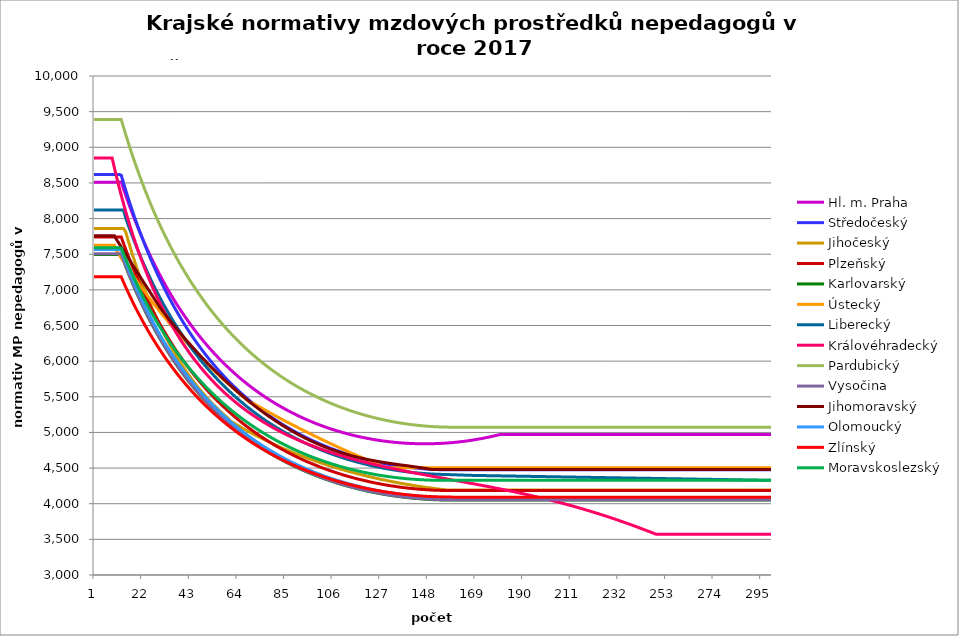
| Category | Hl. m. Praha | Středočeský | Jihočeský | Plzeňský | Karlovarský  | Ústecký   | Liberecký | Královéhradecký | Pardubický | Vysočina | Jihomoravský | Olomoucký | Zlínský | Moravskoslezský |
|---|---|---|---|---|---|---|---|---|---|---|---|---|---|---|
| 0 | 8511.038 | 8619.444 | 7860.65 | 7740.718 | 7496.677 | 7624.648 | 8120.322 | 8849.185 | 9389.89 | 7505.184 | 7757.725 | 7565.608 | 7182.125 | 7589.077 |
| 1 | 8511.038 | 8619.444 | 7860.65 | 7740.718 | 7496.677 | 7624.648 | 8120.322 | 8849.185 | 9389.89 | 7505.184 | 7757.725 | 7565.608 | 7182.125 | 7589.077 |
| 2 | 8511.038 | 8619.444 | 7860.65 | 7740.718 | 7496.677 | 7624.648 | 8120.322 | 8849.185 | 9389.89 | 7505.184 | 7757.725 | 7565.608 | 7182.125 | 7589.077 |
| 3 | 8511.038 | 8619.444 | 7860.65 | 7740.718 | 7496.677 | 7624.648 | 8120.322 | 8849.185 | 9389.89 | 7505.184 | 7757.725 | 7565.608 | 7182.125 | 7589.077 |
| 4 | 8511.038 | 8619.444 | 7860.65 | 7740.718 | 7496.677 | 7624.648 | 8120.322 | 8849.185 | 9389.89 | 7505.184 | 7757.725 | 7565.608 | 7182.125 | 7589.077 |
| 5 | 8511.038 | 8619.444 | 7860.65 | 7740.718 | 7496.677 | 7624.648 | 8120.322 | 8849.185 | 9389.89 | 7505.184 | 7757.725 | 7565.608 | 7182.125 | 7589.077 |
| 6 | 8511.038 | 8619.444 | 7860.65 | 7740.718 | 7496.677 | 7624.648 | 8120.322 | 8849.185 | 9389.89 | 7505.184 | 7757.725 | 7565.608 | 7182.125 | 7589.077 |
| 7 | 8511.038 | 8619.444 | 7860.65 | 7740.718 | 7496.677 | 7624.648 | 8120.322 | 8849.185 | 9389.89 | 7505.184 | 7757.725 | 7565.608 | 7182.125 | 7589.077 |
| 8 | 8511.038 | 8619.444 | 7860.65 | 7740.718 | 7496.677 | 7624.648 | 8120.322 | 8849.185 | 9389.89 | 7505.184 | 7757.725 | 7565.608 | 7182.125 | 7589.077 |
| 9 | 8511.038 | 8619.444 | 7860.65 | 7740.718 | 7496.677 | 7624.648 | 8120.322 | 8711.522 | 9389.89 | 7505.184 | 7757.725 | 7565.608 | 7182.125 | 7589.077 |
| 10 | 8511.038 | 8619.444 | 7860.65 | 7740.718 | 7496.677 | 7548.235 | 8120.322 | 8578.076 | 9389.89 | 7505.184 | 7702.149 | 7565.608 | 7182.125 | 7589.077 |
| 11 | 8511.038 | 8619.444 | 7860.65 | 7740.718 | 7496.677 | 7499.221 | 8120.322 | 8448.656 | 9389.89 | 7505.184 | 7653.769 | 7565.608 | 7182.125 | 7589.077 |
| 12 | 8512.477 | 8608.982 | 7860.65 | 7740.718 | 7496.743 | 7447.635 | 8120.394 | 8326.952 | 9389.974 | 7505.184 | 7602.829 | 7565.608 | 7182.125 | 7587.935 |
| 13 | 8417.493 | 8501.059 | 7860.65 | 7652.562 | 7410.717 | 7399.915 | 8120.486 | 8212.466 | 9282.221 | 7419.061 | 7552.562 | 7476.601 | 7108.883 | 7508.208 |
| 14 | 8325.293 | 8396.528 | 7811.908 | 7566.392 | 7327.213 | 7352.801 | 8006.101 | 8097.424 | 9177.63 | 7335.527 | 7502.956 | 7392.848 | 7037.608 | 7430.687 |
| 15 | 8235.765 | 8295.239 | 7700.734 | 7482.141 | 7246.129 | 7303.204 | 7916.739 | 7989.122 | 9076.068 | 7254.475 | 7450.958 | 7310.95 | 6968.226 | 7355.289 |
| 16 | 8148.801 | 8197.05 | 7593.781 | 7399.746 | 7167.366 | 7257.31 | 7829.951 | 7883.678 | 8977.415 | 7175.499 | 7402.673 | 7230.847 | 6900.669 | 7281.932 |
| 17 | 8064.301 | 8101.828 | 7490.831 | 7322.213 | 7090.831 | 7211.99 | 7745.635 | 7784.361 | 8881.552 | 7098.818 | 7352.051 | 7155.463 | 6834.869 | 7210.541 |
| 18 | 7982.168 | 8009.447 | 7391.679 | 7246.288 | 7016.438 | 7164.268 | 7663.692 | 7687.516 | 8788.372 | 7024.342 | 7302.117 | 7078.713 | 6770.764 | 7141.042 |
| 19 | 7902.311 | 7919.79 | 7296.134 | 7171.921 | 6944.102 | 7120.099 | 7584.03 | 7593.051 | 8697.768 | 6951.982 | 7249.98 | 7006.452 | 6708.294 | 7073.368 |
| 20 | 7824.645 | 7832.743 | 7204.02 | 7099.065 | 6873.746 | 7076.471 | 7506.56 | 7504.02 | 8609.644 | 6881.658 | 7201.418 | 6935.651 | 6647.401 | 7007.452 |
| 21 | 7749.087 | 7748.202 | 7115.171 | 7027.675 | 6805.293 | 7030.519 | 7431.199 | 7417.053 | 8523.904 | 6813.015 | 7150.704 | 6866.267 | 6588.032 | 6943.233 |
| 22 | 7675.559 | 7666.066 | 7029.43 | 6957.706 | 6738.673 | 6987.979 | 7357.868 | 7335.08 | 8440.46 | 6746.266 | 7100.699 | 6800.951 | 6530.134 | 6880.65 |
| 23 | 7603.988 | 7586.241 | 6946.654 | 6891.834 | 6673.819 | 6945.95 | 7286.491 | 7251.963 | 8359.228 | 6681.339 | 7051.389 | 6734.223 | 6473.657 | 6819.648 |
| 24 | 7534.304 | 7508.636 | 6866.705 | 6827.198 | 6610.666 | 6901.673 | 7216.998 | 7173.579 | 8280.126 | 6618.168 | 7002.759 | 6671.384 | 6418.556 | 6760.172 |
| 25 | 7466.438 | 7433.166 | 6789.457 | 6763.763 | 6549.153 | 6860.673 | 7149.319 | 7099.683 | 8203.079 | 6556.687 | 6954.795 | 6609.707 | 6364.783 | 6702.171 |
| 26 | 7400.328 | 7359.751 | 6714.789 | 6701.496 | 6489.223 | 6820.157 | 7083.391 | 7024.539 | 8128.014 | 6496.587 | 6904.873 | 6549.16 | 6312.297 | 6645.595 |
| 27 | 7335.914 | 7288.315 | 6642.588 | 6640.365 | 6430.819 | 6777.465 | 7019.152 | 6956.366 | 8054.861 | 6438.068 | 6855.664 | 6489.713 | 6261.056 | 6590.399 |
| 28 | 7273.136 | 7218.783 | 6572.749 | 6582.818 | 6373.89 | 6737.923 | 6956.542 | 6886.856 | 7983.554 | 6381.074 | 6807.151 | 6431.334 | 6211.02 | 6536.536 |
| 29 | 7211.94 | 7151.088 | 6505.173 | 6523.824 | 6318.384 | 6698.84 | 6895.506 | 6821.317 | 7914.031 | 6325.554 | 6756.821 | 6376.366 | 6162.151 | 6483.964 |
| 30 | 7152.274 | 7085.162 | 6439.764 | 6468.271 | 6264.254 | 6657.648 | 6835.991 | 6757.014 | 7846.231 | 6271.455 | 6714.622 | 6320 | 6114.414 | 6432.643 |
| 31 | 7094.087 | 7020.944 | 6376.434 | 6413.656 | 6211.454 | 6619.488 | 6777.946 | 6693.911 | 7780.096 | 6218.502 | 6672.946 | 6266.91 | 6067.774 | 6382.532 |
| 32 | 7037.33 | 6958.374 | 6315.1 | 6362.272 | 6159.94 | 6581.763 | 6721.322 | 6634.432 | 7715.573 | 6166.885 | 6631.785 | 6214.705 | 6022.197 | 6333.595 |
| 33 | 6981.959 | 6897.395 | 6255.683 | 6309.426 | 6109.671 | 6541.994 | 6666.072 | 6576 | 7652.609 | 6116.56 | 6591.129 | 6165.577 | 5977.653 | 6285.795 |
| 34 | 6927.93 | 6837.952 | 6198.107 | 6259.692 | 6060.606 | 6505.145 | 6612.153 | 6518.589 | 7591.154 | 6067.483 | 6550.968 | 6115.039 | 5934.109 | 6239.098 |
| 35 | 6875.199 | 6779.994 | 6142.302 | 6208.529 | 6012.708 | 6468.708 | 6559.522 | 6464.502 | 7531.159 | 6019.616 | 6511.293 | 6067.468 | 5891.537 | 6193.471 |
| 36 | 6823.728 | 6723.472 | 6088.202 | 6160.367 | 5965.939 | 6430.29 | 6508.138 | 6411.306 | 7472.579 | 5972.709 | 6472.096 | 6020.632 | 5849.909 | 6148.882 |
| 37 | 6773.477 | 6668.338 | 6035.743 | 6112.946 | 5920.265 | 6394.684 | 6457.962 | 6358.978 | 7415.371 | 5926.942 | 6433.369 | 5974.513 | 5809.197 | 6105.301 |
| 38 | 6724.411 | 6614.548 | 5984.864 | 6068.357 | 5875.653 | 6359.471 | 6408.957 | 6307.497 | 7359.492 | 5882.279 | 6395.101 | 5929.095 | 5769.377 | 6062.698 |
| 39 | 6676.492 | 6562.057 | 5935.509 | 6022.337 | 5832.069 | 6322.336 | 6361.088 | 6259.029 | 7304.902 | 5838.687 | 6357.287 | 5884.362 | 5730.422 | 6021.047 |
| 40 | 6629.689 | 6510.826 | 5887.624 | 5979.055 | 5789.484 | 6287.913 | 6314.32 | 6211.3 | 7251.563 | 5796.133 | 6319.917 | 5842.288 | 5692.309 | 5980.319 |
| 41 | 6583.967 | 6460.815 | 5841.158 | 5936.391 | 5747.868 | 6251.606 | 6268.621 | 6166.414 | 7199.437 | 5754.391 | 6282.984 | 5800.811 | 5655.014 | 5940.489 |
| 42 | 6539.297 | 6411.985 | 5796.061 | 5894.332 | 5707.193 | 6217.947 | 6223.959 | 6120.082 | 7148.489 | 5713.63 | 6248.615 | 5757.987 | 5618.517 | 5901.533 |
| 43 | 6495.648 | 6364.301 | 5752.287 | 5852.864 | 5667.43 | 6184.648 | 6180.303 | 6076.501 | 7098.685 | 5673.823 | 6212.508 | 5719.6 | 5582.794 | 5863.425 |
| 44 | 6452.991 | 6317.729 | 5709.793 | 5811.976 | 5628.555 | 6149.521 | 6137.626 | 6033.535 | 7049.993 | 5634.942 | 6176.816 | 5679.841 | 5547.827 | 5826.144 |
| 45 | 6411.3 | 6272.235 | 5668.536 | 5773.562 | 5590.542 | 6116.949 | 6095.9 | 5993.177 | 7002.38 | 5596.96 | 6141.532 | 5640.631 | 5513.594 | 5789.667 |
| 46 | 6370.546 | 6227.787 | 5628.477 | 5735.653 | 5553.367 | 6084.721 | 6055.097 | 5953.355 | 6955.817 | 5559.669 | 6106.649 | 5603.788 | 5480.077 | 5753.973 |
| 47 | 6330.706 | 6184.355 | 5589.576 | 5698.239 | 5517.008 | 6050.716 | 6015.191 | 5914.059 | 6910.274 | 5523.232 | 6072.159 | 5567.424 | 5447.257 | 5719.042 |
| 48 | 6291.754 | 6141.909 | 5551.799 | 5661.309 | 5481.44 | 6019.18 | 5976.159 | 5875.279 | 6865.725 | 5487.625 | 6040.053 | 5531.528 | 5415.117 | 5684.853 |
| 49 | 6253.667 | 6100.422 | 5515.11 | 5624.855 | 5446.644 | 5987.971 | 5937.977 | 5838.905 | 6822.141 | 5452.825 | 6006.31 | 5496.092 | 5383.64 | 5651.388 |
| 50 | 6216.422 | 6059.866 | 5479.477 | 5588.868 | 5412.599 | 5955.036 | 5900.621 | 5802.979 | 6779.498 | 5418.81 | 5972.941 | 5461.108 | 5352.809 | 5618.628 |
| 51 | 6179.998 | 6020.216 | 5444.868 | 5555.103 | 5379.284 | 5924.487 | 5864.071 | 5767.493 | 6737.77 | 5385.388 | 5939.942 | 5428.282 | 5322.609 | 5586.557 |
| 52 | 6144.372 | 5981.447 | 5411.253 | 5521.745 | 5346.681 | 5894.25 | 5828.303 | 5732.438 | 6696.934 | 5352.714 | 5909.214 | 5395.849 | 5293.023 | 5555.155 |
| 53 | 6109.526 | 5943.534 | 5378.603 | 5488.784 | 5314.771 | 5862.335 | 5793.299 | 5699.618 | 6656.966 | 5320.769 | 5876.913 | 5363.801 | 5264.038 | 5524.409 |
| 54 | 6075.44 | 5906.454 | 5346.891 | 5456.215 | 5283.537 | 5832.727 | 5759.039 | 5667.173 | 6617.844 | 5289.533 | 5844.963 | 5332.132 | 5235.638 | 5494.3 |
| 55 | 6042.095 | 5870.186 | 5316.091 | 5425.714 | 5252.962 | 5803.417 | 5725.504 | 5635.094 | 6579.546 | 5258.988 | 5815.208 | 5300.834 | 5207.811 | 5464.815 |
| 56 | 6009.472 | 5834.708 | 5286.178 | 5393.887 | 5223.028 | 5772.476 | 5692.675 | 5605.13 | 6542.054 | 5228.955 | 5783.924 | 5269.902 | 5180.542 | 5435.938 |
| 57 | 5977.554 | 5800 | 5257.127 | 5364.077 | 5193.721 | 5743.767 | 5660.535 | 5573.748 | 6505.345 | 5199.583 | 5752.975 | 5240.929 | 5153.819 | 5407.656 |
| 58 | 5946.326 | 5766.041 | 5228.917 | 5334.595 | 5165.024 | 5715.341 | 5629.067 | 5544.431 | 6469.401 | 5170.854 | 5724.147 | 5212.272 | 5127.629 | 5379.954 |
| 59 | 5915.769 | 5732.814 | 5201.525 | 5305.436 | 5136.924 | 5685.33 | 5598.255 | 5517.118 | 6434.204 | 5142.753 | 5693.832 | 5183.927 | 5101.961 | 5352.819 |
| 60 | 5885.869 | 5700.298 | 5164.043 | 5276.593 | 5109.405 | 5657.479 | 5568.083 | 5488.392 | 6399.736 | 5115.265 | 5665.592 | 5155.889 | 5076.802 | 5326.238 |
| 61 | 5856.61 | 5668.477 | 5144.544 | 5249.639 | 5082.455 | 5629.899 | 5538.535 | 5461.628 | 6365.98 | 5088.222 | 5635.893 | 5128.153 | 5052.142 | 5300.199 |
| 62 | 5827.978 | 5637.334 | 5125.338 | 5221.399 | 5056.059 | 5600.776 | 5509.598 | 5435.123 | 6332.918 | 5061.766 | 5608.223 | 5102.23 | 5027.97 | 5274.69 |
| 63 | 5799.959 | 5606.852 | 5106.421 | 5195.004 | 5030.205 | 5573.745 | 5481.256 | 5408.874 | 6300.535 | 5035.883 | 5579.121 | 5076.568 | 5004.274 | 5249.7 |
| 64 | 5772.539 | 5577.015 | 5087.787 | 5168.876 | 5004.881 | 5546.974 | 5453.497 | 5382.878 | 6268.815 | 5010.56 | 5552.005 | 5049.676 | 4981.046 | 5225.216 |
| 65 | 5745.705 | 5547.808 | 5069.433 | 5143.009 | 4980.074 | 5518.7 | 5426.306 | 5358.732 | 6237.743 | 4985.784 | 5525.151 | 5024.539 | 4958.274 | 5201.228 |
| 66 | 5719.444 | 5519.216 | 5051.354 | 5117.399 | 4955.773 | 5492.454 | 5399.672 | 5334.802 | 6207.306 | 4961.397 | 5498.556 | 5001.108 | 4935.949 | 5177.726 |
| 67 | 5693.744 | 5491.225 | 5033.545 | 5093.528 | 4931.967 | 5466.456 | 5373.581 | 5311.085 | 6177.487 | 4937.535 | 5472.216 | 4976.45 | 4914.063 | 5154.7 |
| 68 | 5668.594 | 5463.822 | 5016.002 | 5069.878 | 4908.645 | 5438.995 | 5348.023 | 5287.577 | 6148.275 | 4914.186 | 5446.126 | 4953.464 | 4892.606 | 5132.139 |
| 69 | 5643.981 | 5436.992 | 4998.72 | 5046.447 | 4885.796 | 5413.5 | 5322.984 | 5265.824 | 6119.657 | 4891.34 | 5420.285 | 4930.69 | 4871.569 | 5110.034 |
| 70 | 5619.894 | 5410.723 | 4981.696 | 5023.232 | 4863.411 | 5413.5 | 5298.455 | 5242.715 | 6091.618 | 4868.985 | 5394.687 | 4908.124 | 4850.944 | 5088.377 |
| 71 | 5596.323 | 5385.003 | 4964.925 | 5000.229 | 4841.479 | 5394.955 | 5274.423 | 5221.329 | 6064.147 | 4846.973 | 5369.33 | 4885.763 | 4830.724 | 5067.157 |
| 72 | 5573.258 | 5359.819 | 4948.404 | 4977.436 | 4819.991 | 5376.536 | 5250.88 | 5200.116 | 6037.233 | 4825.433 | 5345.774 | 4863.605 | 4810.899 | 5046.366 |
| 73 | 5550.688 | 5335.16 | 4932.129 | 4956.255 | 4798.938 | 5358.243 | 5227.814 | 5180.572 | 6010.864 | 4804.356 | 5320.873 | 4843.014 | 4791.462 | 5025.997 |
| 74 | 5528.604 | 5311.014 | 4916.095 | 4935.254 | 4778.311 | 5340.074 | 5205.216 | 5159.689 | 5985.028 | 4783.733 | 5297.739 | 4821.242 | 4772.407 | 5006.04 |
| 75 | 5506.996 | 5287.372 | 4900.3 | 4914.43 | 4758.102 | 5322.028 | 5183.077 | 5140.448 | 5959.714 | 4763.555 | 5274.805 | 4801.007 | 4753.725 | 4986.489 |
| 76 | 5485.855 | 5264.222 | 4884.739 | 4893.782 | 4738.301 | 5304.103 | 5161.386 | 5121.349 | 5934.913 | 4743.678 | 5250.56 | 4780.942 | 4735.409 | 4967.334 |
| 77 | 5465.173 | 5241.554 | 4869.41 | 4873.305 | 4718.902 | 5286.298 | 5140.136 | 5102.392 | 5910.615 | 4724.23 | 5228.032 | 4761.043 | 4717.454 | 4948.57 |
| 78 | 5444.941 | 5219.359 | 4854.308 | 4854.348 | 4699.896 | 5268.613 | 5119.318 | 5085.017 | 5886.809 | 4705.203 | 5207.179 | 4742.62 | 4699.852 | 4930.188 |
| 79 | 5425.15 | 5197.626 | 4839.43 | 4834.2 | 4681.275 | 5251.046 | 5098.922 | 5066.327 | 5863.486 | 4686.587 | 5185.021 | 4724.339 | 4682.597 | 4912.182 |
| 80 | 5405.792 | 5176.347 | 4824.774 | 4815.546 | 4663.033 | 5233.595 | 5078.942 | 5049.197 | 5840.636 | 4668.375 | 5163.051 | 4704.908 | 4665.682 | 4894.546 |
| 81 | 5386.861 | 5155.513 | 4810.336 | 4797.035 | 4645.161 | 5216.26 | 5059.37 | 5032.182 | 5818.252 | 4650.432 | 5142.712 | 4686.916 | 4649.103 | 4877.271 |
| 82 | 5368.348 | 5135.115 | 4796.112 | 4779.973 | 4627.654 | 5199.04 | 5040.197 | 5015.281 | 5796.324 | 4632.88 | 5122.534 | 4669.061 | 4632.852 | 4860.354 |
| 83 | 5350.246 | 5115.144 | 4782.1 | 4761.733 | 4610.505 | 5181.932 | 5021.416 | 4998.494 | 5774.843 | 4615.712 | 5101.088 | 4652.603 | 4616.925 | 4843.786 |
| 84 | 5332.549 | 5095.594 | 4768.297 | 4744.921 | 4593.707 | 5164.937 | 5003.021 | 4983.204 | 5753.803 | 4598.919 | 5082.647 | 4635.008 | 4601.315 | 4827.562 |
| 85 | 5315.248 | 5076.455 | 4754.7 | 4726.948 | 4577.253 | 5149.584 | 4985.004 | 4966.63 | 5733.194 | 4582.497 | 5062.936 | 4618.789 | 4586.018 | 4811.677 |
| 86 | 5298.339 | 5057.72 | 4741.306 | 4710.38 | 4561.139 | 5132.8 | 4967.359 | 4951.534 | 5713.01 | 4566.314 | 5043.377 | 4602.682 | 4571.028 | 4796.125 |
| 87 | 5281.813 | 5039.383 | 4728.112 | 4693.928 | 4545.357 | 5116.125 | 4950.078 | 4936.529 | 5693.243 | 4550.49 | 5025.351 | 4586.688 | 4556.341 | 4780.9 |
| 88 | 5265.666 | 5021.435 | 4715.116 | 4678.843 | 4529.902 | 5099.558 | 4933.157 | 4922.967 | 5673.885 | 4535.018 | 5007.452 | 4570.804 | 4541.95 | 4765.997 |
| 89 | 5249.891 | 5003.87 | 4702.315 | 4662.61 | 4514.769 | 5083.099 | 4916.588 | 4908.135 | 5654.93 | 4519.892 | 4989.681 | 4556.24 | 4527.853 | 4751.411 |
| 90 | 5234.483 | 4986.682 | 4689.706 | 4647.725 | 4499.952 | 5066.745 | 4900.366 | 4893.392 | 5636.372 | 4505.106 | 4972.035 | 4540.566 | 4514.043 | 4737.137 |
| 91 | 5219.435 | 4969.863 | 4677.287 | 4632.936 | 4485.446 | 5050.496 | 4884.485 | 4880.065 | 5618.202 | 4490.536 | 4954.513 | 4526.194 | 4500.517 | 4723.171 |
| 92 | 5204.743 | 4953.407 | 4665.056 | 4618.239 | 4471.246 | 5034.35 | 4868.94 | 4866.812 | 5600.416 | 4476.296 | 4938.449 | 4511.912 | 4487.271 | 4709.506 |
| 93 | 5190.401 | 4937.309 | 4653.009 | 4603.636 | 4457.347 | 5018.308 | 4853.724 | 4853.629 | 5583.007 | 4462.381 | 4922.489 | 4497.72 | 4474.299 | 4696.14 |
| 94 | 5176.403 | 4921.562 | 4641.145 | 4589.125 | 4443.744 | 5002.368 | 4838.834 | 4840.519 | 5565.969 | 4448.787 | 4906.631 | 4483.616 | 4461.599 | 4683.068 |
| 95 | 5162.746 | 4906.162 | 4629.461 | 4575.904 | 4430.433 | 4986.528 | 4824.263 | 4827.478 | 5549.296 | 4435.507 | 4890.875 | 4470.766 | 4449.165 | 4670.285 |
| 96 | 5149.424 | 4891.101 | 4617.955 | 4562.758 | 4417.409 | 4970.789 | 4810.006 | 4815.802 | 5532.982 | 4422.421 | 4876.521 | 4457.989 | 4436.994 | 4657.787 |
| 97 | 5136.433 | 4876.375 | 4606.624 | 4549.688 | 4404.667 | 4955.149 | 4796.06 | 4802.895 | 5517.023 | 4409.642 | 4862.251 | 4444.134 | 4425.083 | 4645.57 |
| 98 | 5123.768 | 4861.979 | 4595.468 | 4536.692 | 4392.204 | 4939.607 | 4782.418 | 4791.337 | 5501.413 | 4397.165 | 4846.778 | 4431.508 | 4413.428 | 4633.63 |
| 99 | 5111.425 | 4847.907 | 4584.483 | 4523.77 | 4380.016 | 4924.161 | 4769.078 | 4779.835 | 5486.146 | 4384.986 | 4833.959 | 4420.093 | 4402.025 | 4621.964 |
| 100 | 5099.399 | 4834.155 | 4573.667 | 4510.922 | 4368.097 | 4908.813 | 4756.034 | 4768.387 | 5471.218 | 4373.099 | 4819.937 | 4407.603 | 4390.87 | 4610.568 |
| 101 | 5087.687 | 4820.718 | 4563.018 | 4499.305 | 4356.446 | 4893.559 | 4743.282 | 4756.995 | 5456.624 | 4361.389 | 4807.259 | 4396.311 | 4379.961 | 4599.438 |
| 102 | 5076.284 | 4807.592 | 4552.535 | 4487.747 | 4345.057 | 4878.4 | 4730.818 | 4745.657 | 5442.359 | 4349.965 | 4794.648 | 4383.955 | 4369.294 | 4588.571 |
| 103 | 5065.188 | 4794.771 | 4542.216 | 4476.249 | 4333.928 | 4863.335 | 4718.638 | 4735.624 | 5428.419 | 4338.823 | 4782.104 | 4372.783 | 4358.867 | 4577.963 |
| 104 | 5054.393 | 4782.252 | 4532.058 | 4464.81 | 4323.054 | 4848.363 | 4706.738 | 4724.387 | 5414.799 | 4327.959 | 4769.624 | 4362.777 | 4348.675 | 4567.612 |
| 105 | 5043.897 | 4770.03 | 4522.06 | 4454.564 | 4312.432 | 4833.482 | 4695.114 | 4714.444 | 5401.495 | 4317.37 | 4758.448 | 4351.712 | 4338.716 | 4557.514 |
| 106 | 5033.697 | 4758.102 | 4512.219 | 4443.235 | 4302.059 | 4818.693 | 4683.763 | 4704.542 | 5388.503 | 4306.941 | 4747.325 | 4340.703 | 4328.988 | 4547.666 |
| 107 | 5023.788 | 4746.463 | 4502.535 | 4433.088 | 4291.933 | 4803.993 | 4672.682 | 4693.452 | 5375.819 | 4296.781 | 4736.253 | 4330.843 | 4319.487 | 4538.065 |
| 108 | 5014.168 | 4735.109 | 4493.005 | 4422.987 | 4282.048 | 4789.383 | 4661.866 | 4683.638 | 5363.438 | 4286.886 | 4726.455 | 4321.027 | 4310.211 | 4528.708 |
| 109 | 5004.834 | 4724.038 | 4483.628 | 4412.933 | 4272.404 | 4774.862 | 4651.312 | 4675.085 | 5351.358 | 4277.252 | 4715.48 | 4311.256 | 4301.156 | 4519.593 |
| 110 | 4995.782 | 4713.245 | 4474.402 | 4402.923 | 4262.996 | 4760.429 | 4641.018 | 4665.348 | 5339.574 | 4267.876 | 4705.767 | 4301.529 | 4292.322 | 4510.717 |
| 111 | 4987.01 | 4702.726 | 4465.325 | 4394.064 | 4253.821 | 4746.082 | 4630.98 | 4655.651 | 5328.083 | 4258.648 | 4696.095 | 4292.92 | 4283.704 | 4502.077 |
| 112 | 4978.514 | 4692.48 | 4456.397 | 4384.141 | 4244.878 | 4731.822 | 4621.195 | 4647.199 | 5316.881 | 4249.674 | 4687.664 | 4283.275 | 4275.301 | 4493.67 |
| 113 | 4970.293 | 4682.501 | 4447.614 | 4375.357 | 4236.164 | 4717.647 | 4611.66 | 4637.578 | 5305.966 | 4240.949 | 4678.065 | 4274.738 | 4267.11 | 4485.495 |
| 114 | 4962.344 | 4672.788 | 4438.976 | 4366.608 | 4228.731 | 4703.557 | 4602.372 | 4629.191 | 5295.333 | 4232.472 | 4669.699 | 4266.236 | 4259.13 | 4477.549 |
| 115 | 4954.664 | 4663.337 | 4430.482 | 4357.895 | 4219.409 | 4690.82 | 4593.329 | 4620.835 | 5284.98 | 4224.239 | 4661.362 | 4257.767 | 4251.357 | 4469.829 |
| 116 | 4947.251 | 4654.145 | 4422.129 | 4349.216 | 4211.365 | 4676.89 | 4584.528 | 4611.323 | 5274.904 | 4216.144 | 4653.055 | 4249.331 | 4243.79 | 4462.334 |
| 117 | 4940.103 | 4645.21 | 4413.917 | 4341.65 | 4203.539 | 4663.042 | 4575.966 | 4603.031 | 5265.102 | 4208.288 | 4645.958 | 4241.978 | 4236.427 | 4455.062 |
| 118 | 4933.216 | 4636.528 | 4405.844 | 4334.111 | 4195.929 | 4649.275 | 4567.641 | 4594.769 | 5255.57 | 4200.67 | 4638.883 | 4233.605 | 4229.266 | 4448.009 |
| 119 | 4926.591 | 4628.097 | 4397.908 | 4326.597 | 4188.534 | 4635.59 | 4559.55 | 4586.537 | 5246.307 | 4193.286 | 4631.83 | 4226.305 | 4222.304 | 4441.175 |
| 120 | 4920.223 | 4619.914 | 4390.109 | 4319.11 | 4181.35 | 4621.985 | 4551.691 | 4579.504 | 5237.31 | 4186.136 | 4624.798 | 4219.031 | 4215.541 | 4434.557 |
| 121 | 4914.112 | 4611.978 | 4382.445 | 4311.649 | 4174.376 | 4608.46 | 4544.062 | 4571.327 | 5228.575 | 4179.113 | 4617.787 | 4211.782 | 4208.974 | 4428.154 |
| 122 | 4908.255 | 4604.285 | 4374.915 | 4304.213 | 4167.611 | 4595.013 | 4536.661 | 4563.178 | 5220.101 | 4172.32 | 4611.961 | 4205.588 | 4202.601 | 4421.964 |
| 123 | 4902.65 | 4596.833 | 4367.517 | 4297.86 | 4161.051 | 4581.645 | 4529.485 | 4556.217 | 5211.885 | 4165.753 | 4606.149 | 4198.385 | 4196.421 | 4415.984 |
| 124 | 4897.297 | 4589.62 | 4360.25 | 4291.525 | 4154.696 | 4568.354 | 4522.533 | 4548.122 | 5203.924 | 4159.411 | 4599.195 | 4192.231 | 4190.432 | 4410.214 |
| 125 | 4892.194 | 4582.644 | 4353.114 | 4285.21 | 4148.543 | 4555.141 | 4515.803 | 4541.206 | 5196.218 | 4153.292 | 4594.57 | 4186.094 | 4184.633 | 4404.652 |
| 126 | 4887.338 | 4575.903 | 4346.107 | 4278.913 | 4142.591 | 4542.003 | 4509.292 | 4533.165 | 5188.763 | 4147.292 | 4588.802 | 4179.976 | 4179.023 | 4399.297 |
| 127 | 4882.728 | 4569.395 | 4339.227 | 4272.634 | 4136.838 | 4528.941 | 4502.999 | 4526.295 | 5181.557 | 4141.512 | 4583.049 | 4173.875 | 4173.598 | 4394.146 |
| 128 | 4878.364 | 4563.118 | 4332.474 | 4267.416 | 4131.283 | 4515.954 | 4496.922 | 4519.445 | 5174.599 | 4135.951 | 4578.457 | 4168.805 | 4168.359 | 4389.199 |
| 129 | 4874.243 | 4557.07 | 4325.847 | 4261.171 | 4125.924 | 4503.041 | 4491.06 | 4512.616 | 5167.886 | 4130.605 | 4572.73 | 4163.747 | 4163.304 | 4384.454 |
| 130 | 4870.365 | 4551.249 | 4319.345 | 4255.981 | 4120.759 | 4503.041 | 4485.41 | 4505.808 | 5161.416 | 4125.475 | 4568.158 | 4157.693 | 4158.432 | 4379.909 |
| 131 | 4866.729 | 4545.654 | 4312.966 | 4250.803 | 4115.787 | 4503.041 | 4479.972 | 4499.021 | 5155.189 | 4120.457 | 4563.596 | 4152.662 | 4153.741 | 4375.565 |
| 132 | 4863.333 | 4540.283 | 4306.709 | 4246.67 | 4111.007 | 4503.041 | 4474.744 | 4492.254 | 5149.202 | 4115.652 | 4559.042 | 4148.646 | 4149.231 | 4371.419 |
| 133 | 4860.176 | 4535.135 | 4300.574 | 4241.515 | 4106.417 | 4503.041 | 4469.724 | 4485.507 | 5143.453 | 4111.057 | 4554.498 | 4143.637 | 4144.899 | 4367.47 |
| 134 | 4857.258 | 4530.208 | 4294.56 | 4237.4 | 4102.017 | 4503.041 | 4464.911 | 4478.78 | 5137.942 | 4106.672 | 4549.963 | 4139.638 | 4140.745 | 4363.718 |
| 135 | 4854.577 | 4525.501 | 4288.666 | 4232.267 | 4097.805 | 4503.041 | 4460.304 | 4472.074 | 5132.666 | 4102.495 | 4545.436 | 4134.651 | 4136.769 | 4360.161 |
| 136 | 4852.133 | 4521.011 | 4282.89 | 4228.17 | 4093.779 | 4503.041 | 4455.901 | 4465.387 | 5127.624 | 4098.425 | 4540.919 | 4130.669 | 4132.968 | 4356.799 |
| 137 | 4849.925 | 4516.739 | 4277.232 | 4224.081 | 4089.94 | 4503.041 | 4451.702 | 4459.831 | 5122.815 | 4094.561 | 4537.537 | 4126.696 | 4129.343 | 4353.63 |
| 138 | 4847.953 | 4512.683 | 4271.691 | 4221.02 | 4086.285 | 4503.041 | 4447.704 | 4453.181 | 5118.237 | 4090.903 | 4533.036 | 4123.72 | 4125.891 | 4350.654 |
| 139 | 4846.216 | 4508.842 | 4266.266 | 4216.944 | 4082.815 | 4503.041 | 4443.908 | 4446.551 | 5113.89 | 4087.448 | 4528.543 | 4119.76 | 4122.613 | 4347.869 |
| 140 | 4844.713 | 4505.214 | 4260.957 | 4213.893 | 4079.527 | 4503.041 | 4440.312 | 4439.941 | 5109.772 | 4084.195 | 4524.059 | 4116.795 | 4119.507 | 4345.276 |
| 141 | 4843.443 | 4501.799 | 4255.762 | 4210.846 | 4076.421 | 4503.041 | 4436.915 | 4434.447 | 5105.882 | 4081.047 | 4519.585 | 4113.834 | 4116.573 | 4342.874 |
| 142 | 4842.408 | 4498.596 | 4250.681 | 4207.803 | 4073.496 | 4503.041 | 4433.717 | 4427.872 | 5102.218 | 4078.099 | 4515.119 | 4110.877 | 4113.81 | 4340.661 |
| 143 | 4841.606 | 4495.603 | 4245.713 | 4204.765 | 4070.752 | 4503.041 | 4430.716 | 4422.409 | 5098.781 | 4075.352 | 4510.661 | 4107.924 | 4111.217 | 4338.638 |
| 144 | 4841.037 | 4492.82 | 4240.857 | 4201.732 | 4068.188 | 4503.041 | 4427.911 | 4415.87 | 5095.569 | 4072.804 | 4506.213 | 4104.976 | 4108.794 | 4336.803 |
| 145 | 4840.7 | 4490.247 | 4236.112 | 4199.712 | 4065.803 | 4503.041 | 4425.302 | 4410.436 | 5092.582 | 4070.455 | 4500.665 | 4103.013 | 4106.54 | 4335.157 |
| 146 | 4840.597 | 4487.882 | 4231.478 | 4197.693 | 4063.596 | 4503.041 | 4422.889 | 4403.932 | 5089.818 | 4068.207 | 4496.236 | 4100.072 | 4104.454 | 4333.699 |
| 147 | 4840.726 | 4485.725 | 4226.955 | 4195.677 | 4061.567 | 4503.041 | 4420.67 | 4398.527 | 5087.276 | 4066.156 | 4490.713 | 4098.113 | 4102.536 | 4332.428 |
| 148 | 4841.088 | 4483.775 | 4222.54 | 4193.663 | 4059.715 | 4503.041 | 4418.645 | 4392.059 | 5084.957 | 4064.303 | 4485.202 | 4096.157 | 4100.786 | 4331.344 |
| 149 | 4841.683 | 4482.031 | 4218.235 | 4191.651 | 4058.041 | 4503.041 | 4416.813 | 4386.683 | 5082.859 | 4062.645 | 4479.706 | 4095.179 | 4099.203 | 4330.448 |
| 150 | 4842.511 | 4480.494 | 4214.037 | 4189.64 | 4056.542 | 4503.041 | 4415.175 | 4380.249 | 5080.983 | 4061.184 | 4479.706 | 4093.225 | 4097.787 | 4329.738 |
| 151 | 4843.573 | 4479.163 | 4209.947 | 4188.636 | 4055.22 | 4503.041 | 4413.729 | 4374.902 | 5079.327 | 4059.822 | 4479.706 | 4092.249 | 4096.537 | 4329.214 |
| 152 | 4844.868 | 4478.037 | 4205.964 | 4187.632 | 4054.073 | 4503.041 | 4412.475 | 4368.503 | 5077.891 | 4058.654 | 4479.706 | 4091.273 | 4095.453 | 4328.877 |
| 153 | 4846.397 | 4477.117 | 4202.087 | 4186.628 | 4053.102 | 4503.041 | 4411.413 | 4363.185 | 5076.674 | 4057.682 | 4479.706 | 4090.298 | 4094.535 | 4328.726 |
| 154 | 4848.161 | 4476.401 | 4198.316 | 4185.625 | 4052.306 | 4503.041 | 4410.542 | 4356.82 | 5075.677 | 4056.905 | 4479.706 | 4089.323 | 4093.782 | 4328.307 |
| 155 | 4850.159 | 4475.89 | 4194.65 | 4185.625 | 4051.685 | 4503.041 | 4409.863 | 4351.53 | 5074.899 | 4056.322 | 4479.706 | 4088.349 | 4093.195 | 4328.307 |
| 156 | 4852.393 | 4475.583 | 4192.347 | 4184.623 | 4051.239 | 4503.041 | 4409.375 | 4345.199 | 5074.34 | 4055.836 | 4479.706 | 4088.349 | 4092.773 | 4328.307 |
| 157 | 4854.863 | 4475.481 | 4192.347 | 4184.623 | 4050.967 | 4503.041 | 4407.784 | 4339.937 | 5074 | 4055.545 | 4479.706 | 4087.375 | 4092.516 | 4328.307 |
| 158 | 4857.57 | 4475.583 | 4192.347 | 4184.623 | 4050.871 | 4503.041 | 4406.724 | 4333.64 | 5073.879 | 4055.448 | 4479.706 | 4087.375 | 4092.425 | 4328.307 |
| 159 | 4860.515 | 4475.583 | 4192.347 | 4184.623 | 4050.948 | 4503.041 | 4405.665 | 4328.406 | 5073.733 | 4055.351 | 4479.706 | 4087.375 | 4091.398 | 4328.307 |
| 160 | 4863.698 | 4475.583 | 4192.347 | 4184.623 | 4050.754 | 4503.041 | 4404.606 | 4322.142 | 5073.733 | 4055.351 | 4479.706 | 4087.375 | 4091.398 | 4328.307 |
| 161 | 4867.121 | 4475.583 | 4192.347 | 4184.623 | 4050.754 | 4503.041 | 4403.548 | 4316.936 | 5073.733 | 4055.351 | 4479.706 | 4087.375 | 4091.398 | 4328.307 |
| 162 | 4870.784 | 4475.583 | 4192.347 | 4184.623 | 4050.754 | 4503.041 | 4402.49 | 4310.705 | 5073.733 | 4055.351 | 4479.706 | 4087.375 | 4091.398 | 4328.307 |
| 163 | 4874.689 | 4475.583 | 4192.347 | 4184.623 | 4050.754 | 4503.041 | 4401.433 | 4305.526 | 5073.733 | 4055.351 | 4479.706 | 4087.375 | 4091.398 | 4328.307 |
| 164 | 4878.837 | 4475.583 | 4192.347 | 4184.623 | 4050.754 | 4503.041 | 4400.376 | 4299.328 | 5073.733 | 4055.351 | 4479.706 | 4087.375 | 4091.398 | 4328.307 |
| 165 | 4883.228 | 4475.583 | 4192.347 | 4184.623 | 4050.754 | 4503.041 | 4399.32 | 4293.148 | 5073.733 | 4055.351 | 4479.706 | 4087.375 | 4091.398 | 4328.307 |
| 166 | 4887.865 | 4475.583 | 4192.347 | 4184.623 | 4050.754 | 4503.041 | 4398.264 | 4286.986 | 5073.733 | 4055.351 | 4479.706 | 4087.375 | 4091.398 | 4328.307 |
| 167 | 4892.748 | 4475.583 | 4192.347 | 4184.623 | 4050.754 | 4503.041 | 4397.209 | 4281.864 | 5073.733 | 4055.351 | 4479.706 | 4087.375 | 4091.398 | 4328.307 |
| 168 | 4897.88 | 4475.583 | 4192.347 | 4184.623 | 4050.754 | 4503.041 | 4397.209 | 4275.734 | 5073.733 | 4055.351 | 4479.706 | 4087.375 | 4091.398 | 4328.307 |
| 169 | 4903.261 | 4475.583 | 4192.347 | 4184.623 | 4050.754 | 4503.041 | 4396.154 | 4269.621 | 5073.733 | 4055.351 | 4479.706 | 4087.375 | 4091.398 | 4328.307 |
| 170 | 4908.893 | 4475.583 | 4192.347 | 4184.623 | 4050.754 | 4503.041 | 4395.581 | 4263.526 | 5073.733 | 4055.351 | 4479.706 | 4087.375 | 4091.398 | 4328.307 |
| 171 | 4914.778 | 4475.583 | 4192.347 | 4184.623 | 4050.754 | 4503.041 | 4395.046 | 4257.448 | 5073.733 | 4055.351 | 4479.706 | 4087.375 | 4091.398 | 4328.307 |
| 172 | 4920.918 | 4475.583 | 4192.347 | 4184.623 | 4050.754 | 4503.041 | 4394.511 | 4251.388 | 5073.733 | 4055.351 | 4479.706 | 4087.375 | 4091.398 | 4328.307 |
| 173 | 4927.314 | 4475.583 | 4192.347 | 4184.623 | 4050.754 | 4503.041 | 4393.977 | 4245.345 | 5073.733 | 4055.351 | 4479.706 | 4087.375 | 4091.398 | 4328.307 |
| 174 | 4933.969 | 4475.583 | 4192.347 | 4184.623 | 4050.754 | 4503.041 | 4393.442 | 4239.319 | 5073.733 | 4055.351 | 4479.706 | 4087.375 | 4091.398 | 4328.307 |
| 175 | 4940.884 | 4475.583 | 4192.347 | 4184.623 | 4050.754 | 4503.041 | 4392.907 | 4233.31 | 5073.733 | 4055.351 | 4479.706 | 4087.375 | 4091.398 | 4328.307 |
| 176 | 4948.062 | 4475.583 | 4192.347 | 4184.623 | 4050.754 | 4503.041 | 4392.373 | 4227.318 | 5073.733 | 4055.351 | 4479.706 | 4087.375 | 4091.398 | 4328.307 |
| 177 | 4955.504 | 4475.583 | 4192.347 | 4184.623 | 4050.754 | 4503.041 | 4391.839 | 4220.349 | 5073.733 | 4055.351 | 4479.706 | 4087.375 | 4091.398 | 4328.307 |
| 178 | 4963.214 | 4475.583 | 4192.347 | 4184.623 | 4050.754 | 4503.041 | 4391.305 | 4214.393 | 5073.733 | 4055.351 | 4479.706 | 4087.375 | 4091.398 | 4328.307 |
| 179 | 4971.193 | 4475.583 | 4192.347 | 4184.623 | 4050.754 | 4503.041 | 4390.77 | 4208.455 | 5073.733 | 4055.351 | 4479.706 | 4087.375 | 4091.398 | 4328.307 |
| 180 | 4971.193 | 4475.583 | 4192.347 | 4184.623 | 4050.754 | 4503.041 | 4390.237 | 4201.547 | 5073.733 | 4055.351 | 4479.706 | 4087.375 | 4091.398 | 4328.307 |
| 181 | 4971.193 | 4475.583 | 4192.347 | 4184.623 | 4050.754 | 4503.041 | 4389.703 | 4195.645 | 5073.733 | 4055.351 | 4479.706 | 4087.375 | 4091.398 | 4328.307 |
| 182 | 4971.193 | 4475.583 | 4192.347 | 4184.623 | 4050.754 | 4503.041 | 4389.169 | 4188.78 | 5073.733 | 4055.351 | 4479.706 | 4087.375 | 4091.398 | 4328.307 |
| 183 | 4971.193 | 4475.583 | 4192.347 | 4184.623 | 4050.754 | 4503.041 | 4388.636 | 4181.937 | 5073.733 | 4055.351 | 4479.706 | 4087.375 | 4091.398 | 4328.307 |
| 184 | 4971.193 | 4475.583 | 4192.347 | 4184.623 | 4050.754 | 4503.041 | 4388.102 | 4175.116 | 5073.733 | 4055.351 | 4479.706 | 4087.375 | 4091.398 | 4328.307 |
| 185 | 4971.193 | 4475.583 | 4192.347 | 4184.623 | 4050.754 | 4503.041 | 4387.569 | 4169.288 | 5073.733 | 4055.351 | 4479.706 | 4087.375 | 4091.398 | 4328.307 |
| 186 | 4971.193 | 4475.583 | 4192.347 | 4184.623 | 4050.754 | 4503.041 | 4387.036 | 4162.509 | 5073.733 | 4055.351 | 4479.706 | 4087.375 | 4091.398 | 4328.307 |
| 187 | 4971.193 | 4475.583 | 4192.347 | 4184.623 | 4050.754 | 4503.041 | 4386.503 | 4155.751 | 5073.733 | 4055.351 | 4479.706 | 4087.375 | 4091.398 | 4328.307 |
| 188 | 4971.193 | 4475.583 | 4192.347 | 4184.623 | 4050.754 | 4503.041 | 4385.97 | 4148.056 | 5073.733 | 4055.351 | 4479.706 | 4087.375 | 4091.398 | 4328.307 |
| 189 | 4971.193 | 4475.583 | 4192.347 | 4184.623 | 4050.754 | 4503.041 | 4385.437 | 4141.345 | 5073.733 | 4055.351 | 4479.706 | 4087.375 | 4091.398 | 4328.307 |
| 190 | 4971.193 | 4475.583 | 4192.347 | 4184.623 | 4050.754 | 4503.041 | 4384.905 | 4134.656 | 5073.733 | 4055.351 | 4479.706 | 4087.375 | 4091.398 | 4328.307 |
| 191 | 4971.193 | 4475.583 | 4192.347 | 4184.623 | 4050.754 | 4503.041 | 4384.372 | 4127.038 | 5073.733 | 4055.351 | 4479.706 | 4087.375 | 4091.398 | 4328.307 |
| 192 | 4971.193 | 4475.583 | 4192.347 | 4184.623 | 4050.754 | 4503.041 | 4383.84 | 4120.395 | 5073.733 | 4055.351 | 4479.706 | 4087.375 | 4091.398 | 4328.307 |
| 193 | 4971.193 | 4475.583 | 4192.347 | 4184.623 | 4050.754 | 4503.041 | 4383.308 | 4112.83 | 5073.733 | 4055.351 | 4479.706 | 4087.375 | 4091.398 | 4328.307 |
| 194 | 4971.193 | 4475.583 | 4192.347 | 4184.623 | 4050.754 | 4503.041 | 4382.776 | 4105.292 | 5073.733 | 4055.351 | 4479.706 | 4087.375 | 4091.398 | 4328.307 |
| 195 | 4971.193 | 4475.583 | 4192.347 | 4184.623 | 4050.754 | 4503.041 | 4382.244 | 4097.782 | 5073.733 | 4055.351 | 4479.706 | 4087.375 | 4091.398 | 4328.307 |
| 196 | 4971.193 | 4475.583 | 4192.347 | 4184.623 | 4050.754 | 4503.041 | 4381.712 | 4090.299 | 5073.733 | 4055.351 | 4479.706 | 4087.375 | 4091.398 | 4328.307 |
| 197 | 4971.193 | 4475.583 | 4192.347 | 4184.623 | 4050.754 | 4503.041 | 4381.18 | 4082.843 | 5073.733 | 4055.351 | 4479.706 | 4087.375 | 4091.398 | 4328.307 |
| 198 | 4971.193 | 4475.583 | 4192.347 | 4184.623 | 4050.754 | 4503.041 | 4380.649 | 4075.415 | 5073.733 | 4055.351 | 4479.706 | 4087.375 | 4091.398 | 4328.307 |
| 199 | 4971.193 | 4475.583 | 4192.347 | 4184.623 | 4050.754 | 4503.041 | 4380.117 | 4068.014 | 5073.733 | 4055.351 | 4479.706 | 4087.375 | 4091.398 | 4328.307 |
| 200 | 4971.193 | 4475.583 | 4192.347 | 4184.623 | 4050.754 | 4503.041 | 4379.586 | 4059.719 | 5073.733 | 4055.351 | 4479.706 | 4087.375 | 4091.398 | 4328.307 |
| 201 | 4971.193 | 4475.583 | 4192.347 | 4184.623 | 4050.754 | 4503.041 | 4379.055 | 4052.374 | 5073.733 | 4055.351 | 4479.706 | 4087.375 | 4091.398 | 4328.307 |
| 202 | 4971.193 | 4475.583 | 4192.347 | 4184.623 | 4050.754 | 4503.041 | 4378.524 | 4044.144 | 5073.733 | 4055.351 | 4479.706 | 4087.375 | 4091.398 | 4328.307 |
| 203 | 4971.193 | 4475.583 | 4192.347 | 4184.623 | 4050.754 | 4503.041 | 4377.993 | 4035.946 | 5073.733 | 4055.351 | 4479.706 | 4087.375 | 4091.398 | 4328.307 |
| 204 | 4971.193 | 4475.583 | 4192.347 | 4184.623 | 4050.754 | 4503.041 | 4377.462 | 4027.782 | 5073.733 | 4055.351 | 4479.706 | 4087.375 | 4091.398 | 4328.307 |
| 205 | 4971.193 | 4475.583 | 4192.347 | 4184.623 | 4050.754 | 4503.041 | 4376.931 | 4019.65 | 5073.733 | 4055.351 | 4479.706 | 4087.375 | 4091.398 | 4328.307 |
| 206 | 4971.193 | 4475.583 | 4192.347 | 4184.623 | 4050.754 | 4503.041 | 4376.401 | 4010.654 | 5073.733 | 4055.351 | 4479.706 | 4087.375 | 4091.398 | 4328.307 |
| 207 | 4971.193 | 4475.583 | 4192.347 | 4184.623 | 4050.754 | 4503.041 | 4375.87 | 4002.591 | 5073.733 | 4055.351 | 4479.706 | 4087.375 | 4091.398 | 4328.307 |
| 208 | 4971.193 | 4475.583 | 4192.347 | 4184.623 | 4050.754 | 4503.041 | 4375.34 | 3993.671 | 5073.733 | 4055.351 | 4479.706 | 4087.375 | 4091.398 | 4328.307 |
| 209 | 4971.193 | 4475.583 | 4192.347 | 4184.623 | 4050.754 | 4503.041 | 4374.81 | 3985.676 | 5073.733 | 4055.351 | 4479.706 | 4087.375 | 4091.398 | 4328.307 |
| 210 | 4971.193 | 4475.583 | 4192.347 | 4184.623 | 4050.754 | 4503.041 | 4374.28 | 3976.831 | 5073.733 | 4055.351 | 4479.706 | 4087.375 | 4091.398 | 4328.307 |
| 211 | 4971.193 | 4475.583 | 4192.347 | 4184.623 | 4050.754 | 4503.041 | 4373.75 | 3968.025 | 5073.733 | 4055.351 | 4479.706 | 4087.375 | 4091.398 | 4328.307 |
| 212 | 4971.193 | 4475.583 | 4192.347 | 4184.623 | 4050.754 | 4503.041 | 4373.22 | 3959.258 | 5073.733 | 4055.351 | 4479.706 | 4087.375 | 4091.398 | 4328.307 |
| 213 | 4971.193 | 4475.583 | 4192.347 | 4184.623 | 4050.754 | 4503.041 | 4372.691 | 3949.658 | 5073.733 | 4055.351 | 4479.706 | 4087.375 | 4091.398 | 4328.307 |
| 214 | 4971.193 | 4475.583 | 4192.347 | 4184.623 | 4050.754 | 4503.041 | 4372.161 | 3940.972 | 5073.733 | 4055.351 | 4479.706 | 4087.375 | 4091.398 | 4328.307 |
| 215 | 4971.193 | 4475.583 | 4192.347 | 4184.623 | 4050.754 | 4503.041 | 4371.632 | 3931.461 | 5073.733 | 4055.351 | 4479.706 | 4087.375 | 4091.398 | 4328.307 |
| 216 | 4971.193 | 4475.583 | 4192.347 | 4184.623 | 4050.754 | 4503.041 | 4371.102 | 3921.996 | 5073.733 | 4055.351 | 4479.706 | 4087.375 | 4091.398 | 4328.307 |
| 217 | 4971.193 | 4475.583 | 4192.347 | 4184.623 | 4050.754 | 4503.041 | 4370.573 | 3912.576 | 5073.733 | 4055.351 | 4479.706 | 4087.375 | 4091.398 | 4328.307 |
| 218 | 4971.193 | 4475.583 | 4192.347 | 4184.623 | 4050.754 | 4503.041 | 4370.044 | 3903.202 | 5073.733 | 4055.351 | 4479.706 | 4087.375 | 4091.398 | 4328.307 |
| 219 | 4971.193 | 4475.583 | 4192.347 | 4184.623 | 4050.754 | 4503.041 | 4369.515 | 3893.872 | 5073.733 | 4055.351 | 4479.706 | 4087.375 | 4091.398 | 4328.307 |
| 220 | 4971.193 | 4475.583 | 4192.347 | 4184.623 | 4050.754 | 4503.041 | 4368.987 | 3883.745 | 5073.733 | 4055.351 | 4479.706 | 4087.375 | 4091.398 | 4328.307 |
| 221 | 4971.193 | 4475.583 | 4192.347 | 4184.623 | 4050.754 | 4503.041 | 4368.458 | 3873.671 | 5073.733 | 4055.351 | 4479.706 | 4087.375 | 4091.398 | 4328.307 |
| 222 | 4971.193 | 4475.583 | 4192.347 | 4184.623 | 4050.754 | 4503.041 | 4367.93 | 3864.481 | 5073.733 | 4055.351 | 4479.706 | 4087.375 | 4091.398 | 4328.307 |
| 223 | 4971.193 | 4475.583 | 4192.347 | 4184.623 | 4050.754 | 4503.041 | 4367.401 | 3854.506 | 5073.733 | 4055.351 | 4479.706 | 4087.375 | 4091.398 | 4328.307 |
| 224 | 4971.193 | 4475.583 | 4192.347 | 4184.623 | 4050.754 | 4503.041 | 4366.873 | 3843.758 | 5073.733 | 4055.351 | 4479.706 | 4087.375 | 4091.398 | 4328.307 |
| 225 | 4971.193 | 4475.583 | 4192.347 | 4184.623 | 4050.754 | 4503.041 | 4366.345 | 3833.89 | 5073.733 | 4055.351 | 4479.706 | 4087.375 | 4091.398 | 4328.307 |
| 226 | 4971.193 | 4475.583 | 4192.347 | 4184.623 | 4050.754 | 4503.041 | 4365.817 | 3823.256 | 5073.733 | 4055.351 | 4479.706 | 4087.375 | 4091.398 | 4328.307 |
| 227 | 4971.193 | 4475.583 | 4192.347 | 4184.623 | 4050.754 | 4503.041 | 4365.289 | 3812.681 | 5073.733 | 4055.351 | 4479.706 | 4087.375 | 4091.398 | 4328.307 |
| 228 | 4971.193 | 4475.583 | 4192.347 | 4184.623 | 4050.754 | 4503.041 | 4364.761 | 3802.164 | 5073.733 | 4055.351 | 4479.706 | 4087.375 | 4091.398 | 4328.307 |
| 229 | 4971.193 | 4475.583 | 4192.347 | 4184.623 | 4050.754 | 4503.041 | 4364.234 | 3791.705 | 5073.733 | 4055.351 | 4479.706 | 4087.375 | 4091.398 | 4328.307 |
| 230 | 4971.193 | 4475.583 | 4192.347 | 4184.623 | 4050.754 | 4503.041 | 4363.706 | 3781.304 | 5073.733 | 4055.351 | 4479.706 | 4087.375 | 4091.398 | 4328.307 |
| 231 | 4971.193 | 4475.583 | 4192.347 | 4184.623 | 4050.754 | 4503.041 | 4363.179 | 3770.166 | 5073.733 | 4055.351 | 4479.706 | 4087.375 | 4091.398 | 4328.307 |
| 232 | 4971.193 | 4475.583 | 4192.347 | 4184.623 | 4050.754 | 4503.041 | 4362.652 | 3759.094 | 5073.733 | 4055.351 | 4479.706 | 4087.375 | 4091.398 | 4328.307 |
| 233 | 4971.193 | 4475.583 | 4192.347 | 4184.623 | 4050.754 | 4503.041 | 4362.125 | 3748.086 | 5073.733 | 4055.351 | 4479.706 | 4087.375 | 4091.398 | 4328.307 |
| 234 | 4971.193 | 4475.583 | 4192.347 | 4184.623 | 4050.754 | 4503.041 | 4361.598 | 3737.143 | 5073.733 | 4055.351 | 4479.706 | 4087.375 | 4091.398 | 4328.307 |
| 235 | 4971.193 | 4475.583 | 4192.347 | 4184.623 | 4050.754 | 4503.041 | 4361.071 | 3725.489 | 5073.733 | 4055.351 | 4479.706 | 4087.375 | 4091.398 | 4328.307 |
| 236 | 4971.193 | 4475.583 | 4192.347 | 4184.623 | 4050.754 | 4503.041 | 4360.544 | 3713.907 | 5073.733 | 4055.351 | 4479.706 | 4087.375 | 4091.398 | 4328.307 |
| 237 | 4971.193 | 4475.583 | 4192.347 | 4184.623 | 4050.754 | 4503.041 | 4360.018 | 3703.162 | 5073.733 | 4055.351 | 4479.706 | 4087.375 | 4091.398 | 4328.307 |
| 238 | 4971.193 | 4475.583 | 4192.347 | 4184.623 | 4050.754 | 4503.041 | 4359.491 | 3690.958 | 5073.733 | 4055.351 | 4479.706 | 4087.375 | 4091.398 | 4328.307 |
| 239 | 4971.193 | 4475.583 | 4192.347 | 4184.623 | 4050.754 | 4503.041 | 4358.965 | 3679.589 | 5073.733 | 4055.351 | 4479.706 | 4087.375 | 4091.398 | 4328.307 |
| 240 | 4971.193 | 4475.583 | 4192.347 | 4184.623 | 4050.754 | 4503.041 | 4358.439 | 3667.54 | 5073.733 | 4055.351 | 4479.706 | 4087.375 | 4091.398 | 4328.307 |
| 241 | 4971.193 | 4475.583 | 4192.347 | 4184.623 | 4050.754 | 4503.041 | 4357.913 | 3655.569 | 5073.733 | 4055.351 | 4479.706 | 4087.375 | 4091.398 | 4328.307 |
| 242 | 4971.193 | 4475.583 | 4192.347 | 4184.623 | 4050.754 | 4503.041 | 4357.387 | 3643.676 | 5073.733 | 4055.351 | 4479.706 | 4087.375 | 4091.398 | 4328.307 |
| 243 | 4971.193 | 4475.583 | 4192.347 | 4184.623 | 4050.754 | 4503.041 | 4356.861 | 3631.861 | 5073.733 | 4055.351 | 4479.706 | 4087.375 | 4091.398 | 4328.307 |
| 244 | 4971.193 | 4475.583 | 4192.347 | 4184.623 | 4050.754 | 4503.041 | 4356.335 | 3619.39 | 5073.733 | 4055.351 | 4479.706 | 4087.375 | 4091.398 | 4328.307 |
| 245 | 4971.193 | 4475.583 | 4192.347 | 4184.623 | 4050.754 | 4503.041 | 4355.81 | 3607.731 | 5073.733 | 4055.351 | 4479.706 | 4087.375 | 4091.398 | 4328.307 |
| 246 | 4971.193 | 4475.583 | 4192.347 | 4184.623 | 4050.754 | 4503.041 | 4355.284 | 3595.425 | 5073.733 | 4055.351 | 4479.706 | 4087.375 | 4091.398 | 4328.307 |
| 247 | 4971.193 | 4475.583 | 4192.347 | 4184.623 | 4050.754 | 4503.041 | 4354.759 | 3582.487 | 5073.733 | 4055.351 | 4479.706 | 4087.375 | 4091.398 | 4328.307 |
| 248 | 4971.193 | 4475.583 | 4192.347 | 4184.623 | 4050.754 | 4503.041 | 4354.234 | 3570.353 | 5073.733 | 4055.351 | 4479.706 | 4087.375 | 4091.398 | 4328.307 |
| 249 | 4971.193 | 4475.583 | 4192.347 | 4184.623 | 4050.754 | 4503.041 | 4353.709 | 3570.353 | 5073.733 | 4055.351 | 4479.706 | 4087.375 | 4091.398 | 4328.307 |
| 250 | 4971.193 | 4475.583 | 4192.347 | 4184.623 | 4050.754 | 4503.041 | 4353.184 | 3570.353 | 5073.733 | 4055.351 | 4479.706 | 4087.375 | 4091.398 | 4328.307 |
| 251 | 4971.193 | 4475.583 | 4192.347 | 4184.623 | 4050.754 | 4503.041 | 4352.659 | 3570.353 | 5073.733 | 4055.351 | 4479.706 | 4087.375 | 4091.398 | 4328.307 |
| 252 | 4971.193 | 4475.583 | 4192.347 | 4184.623 | 4050.754 | 4503.041 | 4352.134 | 3570.353 | 5073.733 | 4055.351 | 4479.706 | 4087.375 | 4091.398 | 4328.307 |
| 253 | 4971.193 | 4475.583 | 4192.347 | 4184.623 | 4050.754 | 4503.041 | 4351.61 | 3570.353 | 5073.733 | 4055.351 | 4479.706 | 4087.375 | 4091.398 | 4328.307 |
| 254 | 4971.193 | 4475.583 | 4192.347 | 4184.623 | 4050.754 | 4503.041 | 4351.085 | 3570.353 | 5073.733 | 4055.351 | 4479.706 | 4087.375 | 4091.398 | 4328.307 |
| 255 | 4971.193 | 4475.583 | 4192.347 | 4184.623 | 4050.754 | 4503.041 | 4350.561 | 3570.353 | 5073.733 | 4055.351 | 4479.706 | 4087.375 | 4091.398 | 4328.307 |
| 256 | 4971.193 | 4475.583 | 4192.347 | 4184.623 | 4050.754 | 4503.041 | 4350.037 | 3570.353 | 5073.733 | 4055.351 | 4479.706 | 4087.375 | 4091.398 | 4328.307 |
| 257 | 4971.193 | 4475.583 | 4192.347 | 4184.623 | 4050.754 | 4503.041 | 4349.513 | 3570.353 | 5073.733 | 4055.351 | 4479.706 | 4087.375 | 4091.398 | 4328.307 |
| 258 | 4971.193 | 4475.583 | 4192.347 | 4184.623 | 4050.754 | 4503.041 | 4348.989 | 3570.353 | 5073.733 | 4055.351 | 4479.706 | 4087.375 | 4091.398 | 4328.307 |
| 259 | 4971.193 | 4475.583 | 4192.347 | 4184.623 | 4050.754 | 4503.041 | 4348.465 | 3570.353 | 5073.733 | 4055.351 | 4479.706 | 4087.375 | 4091.398 | 4328.307 |
| 260 | 4971.193 | 4475.583 | 4192.347 | 4184.623 | 4050.754 | 4503.041 | 4347.941 | 3570.353 | 5073.733 | 4055.351 | 4479.706 | 4087.375 | 4091.398 | 4328.307 |
| 261 | 4971.193 | 4475.583 | 4192.347 | 4184.623 | 4050.754 | 4503.041 | 4347.418 | 3570.353 | 5073.733 | 4055.351 | 4479.706 | 4087.375 | 4091.398 | 4328.307 |
| 262 | 4971.193 | 4475.583 | 4192.347 | 4184.623 | 4050.754 | 4503.041 | 4346.894 | 3570.353 | 5073.733 | 4055.351 | 4479.706 | 4087.375 | 4091.398 | 4328.307 |
| 263 | 4971.193 | 4475.583 | 4192.347 | 4184.623 | 4050.754 | 4503.041 | 4346.371 | 3570.353 | 5073.733 | 4055.351 | 4479.706 | 4087.375 | 4091.398 | 4328.307 |
| 264 | 4971.193 | 4475.583 | 4192.347 | 4184.623 | 4050.754 | 4503.041 | 4345.848 | 3570.353 | 5073.733 | 4055.351 | 4479.706 | 4087.375 | 4091.398 | 4328.307 |
| 265 | 4971.193 | 4475.583 | 4192.347 | 4184.623 | 4050.754 | 4503.041 | 4345.325 | 3570.353 | 5073.733 | 4055.351 | 4479.706 | 4087.375 | 4091.398 | 4328.307 |
| 266 | 4971.193 | 4475.583 | 4192.347 | 4184.623 | 4050.754 | 4503.041 | 4344.802 | 3570.353 | 5073.733 | 4055.351 | 4479.706 | 4087.375 | 4091.398 | 4328.307 |
| 267 | 4971.193 | 4475.583 | 4192.347 | 4184.623 | 4050.754 | 4503.041 | 4344.279 | 3570.353 | 5073.733 | 4055.351 | 4479.706 | 4087.375 | 4091.398 | 4328.307 |
| 268 | 4971.193 | 4475.583 | 4192.347 | 4184.623 | 4050.754 | 4503.041 | 4343.757 | 3570.353 | 5073.733 | 4055.351 | 4479.706 | 4087.375 | 4091.398 | 4328.307 |
| 269 | 4971.193 | 4475.583 | 4192.347 | 4184.623 | 4050.754 | 4503.041 | 4343.234 | 3570.353 | 5073.733 | 4055.351 | 4479.706 | 4087.375 | 4091.398 | 4328.307 |
| 270 | 4971.193 | 4475.583 | 4192.347 | 4184.623 | 4050.754 | 4503.041 | 4342.712 | 3570.353 | 5073.733 | 4055.351 | 4479.706 | 4087.375 | 4091.398 | 4328.307 |
| 271 | 4971.193 | 4475.583 | 4192.347 | 4184.623 | 4050.754 | 4503.041 | 4342.189 | 3570.353 | 5073.733 | 4055.351 | 4479.706 | 4087.375 | 4091.398 | 4328.307 |
| 272 | 4971.193 | 4475.583 | 4192.347 | 4184.623 | 4050.754 | 4503.041 | 4341.667 | 3570.353 | 5073.733 | 4055.351 | 4479.706 | 4087.375 | 4091.398 | 4328.307 |
| 273 | 4971.193 | 4475.583 | 4192.347 | 4184.623 | 4050.754 | 4503.041 | 4341.145 | 3570.353 | 5073.733 | 4055.351 | 4479.706 | 4087.375 | 4091.398 | 4328.307 |
| 274 | 4971.193 | 4475.583 | 4192.347 | 4184.623 | 4050.754 | 4503.041 | 4340.623 | 3570.353 | 5073.733 | 4055.351 | 4479.706 | 4087.375 | 4091.398 | 4328.307 |
| 275 | 4971.193 | 4475.583 | 4192.347 | 4184.623 | 4050.754 | 4503.041 | 4340.102 | 3570.353 | 5073.733 | 4055.351 | 4479.706 | 4087.375 | 4091.398 | 4328.307 |
| 276 | 4971.193 | 4475.583 | 4192.347 | 4184.623 | 4050.754 | 4503.041 | 4339.58 | 3570.353 | 5073.733 | 4055.351 | 4479.706 | 4087.375 | 4091.398 | 4328.307 |
| 277 | 4971.193 | 4475.583 | 4192.347 | 4184.623 | 4050.754 | 4503.041 | 4339.058 | 3570.353 | 5073.733 | 4055.351 | 4479.706 | 4087.375 | 4091.398 | 4328.307 |
| 278 | 4971.193 | 4475.583 | 4192.347 | 4184.623 | 4050.754 | 4503.041 | 4338.537 | 3570.353 | 5073.733 | 4055.351 | 4479.706 | 4087.375 | 4091.398 | 4328.307 |
| 279 | 4971.193 | 4475.583 | 4192.347 | 4184.623 | 4050.754 | 4503.041 | 4338.016 | 3570.353 | 5073.733 | 4055.351 | 4479.706 | 4087.375 | 4091.398 | 4328.307 |
| 280 | 4971.193 | 4475.583 | 4192.347 | 4184.623 | 4050.754 | 4503.041 | 4337.495 | 3570.353 | 5073.733 | 4055.351 | 4479.706 | 4087.375 | 4091.398 | 4328.307 |
| 281 | 4971.193 | 4475.583 | 4192.347 | 4184.623 | 4050.754 | 4503.041 | 4336.974 | 3570.353 | 5073.733 | 4055.351 | 4479.706 | 4087.375 | 4091.398 | 4328.307 |
| 282 | 4971.193 | 4475.583 | 4192.347 | 4184.623 | 4050.754 | 4503.041 | 4336.453 | 3570.353 | 5073.733 | 4055.351 | 4479.706 | 4087.375 | 4091.398 | 4328.307 |
| 283 | 4971.193 | 4475.583 | 4192.347 | 4184.623 | 4050.754 | 4503.041 | 4335.932 | 3570.353 | 5073.733 | 4055.351 | 4479.706 | 4087.375 | 4091.398 | 4328.307 |
| 284 | 4971.193 | 4475.583 | 4192.347 | 4184.623 | 4050.754 | 4503.041 | 4335.411 | 3570.353 | 5073.733 | 4055.351 | 4479.706 | 4087.375 | 4091.398 | 4328.307 |
| 285 | 4971.193 | 4475.583 | 4192.347 | 4184.623 | 4050.754 | 4503.041 | 4334.891 | 3570.353 | 5073.733 | 4055.351 | 4479.706 | 4087.375 | 4091.398 | 4328.307 |
| 286 | 4971.193 | 4475.583 | 4192.347 | 4184.623 | 4050.754 | 4503.041 | 4334.37 | 3570.353 | 5073.733 | 4055.351 | 4479.706 | 4087.375 | 4091.398 | 4328.307 |
| 287 | 4971.193 | 4475.583 | 4192.347 | 4184.623 | 4050.754 | 4503.041 | 4333.85 | 3570.353 | 5073.733 | 4055.351 | 4479.706 | 4087.375 | 4091.398 | 4328.307 |
| 288 | 4971.193 | 4475.583 | 4192.347 | 4184.623 | 4050.754 | 4503.041 | 4333.33 | 3570.353 | 5073.733 | 4055.351 | 4479.706 | 4087.375 | 4091.398 | 4328.307 |
| 289 | 4971.193 | 4475.583 | 4192.347 | 4184.623 | 4050.754 | 4503.041 | 4332.81 | 3570.353 | 5073.733 | 4055.351 | 4479.706 | 4087.375 | 4091.398 | 4328.307 |
| 290 | 4971.193 | 4475.583 | 4192.347 | 4184.623 | 4050.754 | 4503.041 | 4332.29 | 3570.353 | 5073.733 | 4055.351 | 4479.706 | 4087.375 | 4091.398 | 4328.307 |
| 291 | 4971.193 | 4475.583 | 4192.347 | 4184.623 | 4050.754 | 4503.041 | 4331.77 | 3570.353 | 5073.733 | 4055.351 | 4479.706 | 4087.375 | 4091.398 | 4328.307 |
| 292 | 4971.193 | 4475.583 | 4192.347 | 4184.623 | 4050.754 | 4503.041 | 4331.251 | 3570.353 | 5073.733 | 4055.351 | 4479.706 | 4087.375 | 4091.398 | 4328.307 |
| 293 | 4971.193 | 4475.583 | 4192.347 | 4184.623 | 4050.754 | 4503.041 | 4330.731 | 3570.353 | 5073.733 | 4055.351 | 4479.706 | 4087.375 | 4091.398 | 4328.307 |
| 294 | 4971.193 | 4475.583 | 4192.347 | 4184.623 | 4050.754 | 4503.041 | 4330.212 | 3570.353 | 5073.733 | 4055.351 | 4479.706 | 4087.375 | 4091.398 | 4328.307 |
| 295 | 4971.193 | 4475.583 | 4192.347 | 4184.623 | 4050.754 | 4503.041 | 4329.692 | 3570.353 | 5073.733 | 4055.351 | 4479.706 | 4087.375 | 4091.398 | 4328.307 |
| 296 | 4971.193 | 4475.583 | 4192.347 | 4184.623 | 4050.754 | 4503.041 | 4329.173 | 3570.353 | 5073.733 | 4055.351 | 4479.706 | 4087.375 | 4091.398 | 4328.307 |
| 297 | 4971.193 | 4475.583 | 4192.347 | 4184.623 | 4050.754 | 4503.041 | 4328.654 | 3570.353 | 5073.733 | 4055.351 | 4479.706 | 4087.375 | 4091.398 | 4328.307 |
| 298 | 4971.193 | 4475.583 | 4192.347 | 4184.623 | 4050.754 | 4503.041 | 4328.135 | 3570.353 | 5073.733 | 4055.351 | 4479.706 | 4087.375 | 4091.398 | 4328.307 |
| 299 | 4971.193 | 4475.583 | 4192.347 | 4184.623 | 4050.754 | 4503.041 | 4327.617 | 3570.353 | 5073.733 | 4055.351 | 4479.706 | 4087.375 | 4091.398 | 4328.307 |